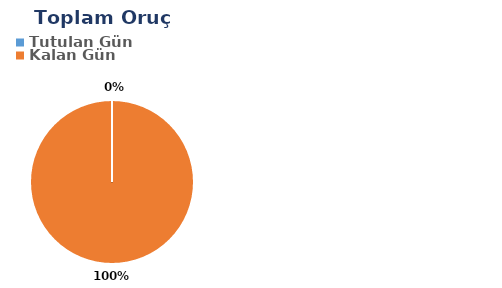
| Category | Toplam |
|---|---|
| Tutulan Gün | 0 |
| Kalan Gün | 29 |